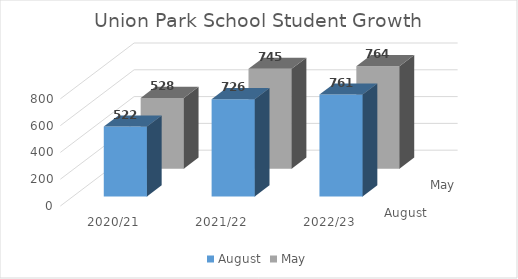
| Category | August | May |
|---|---|---|
| 2020/21 | 522 | 528 |
| 2021/22 | 726 | 745 |
| 2022/23 | 761 | 764 |